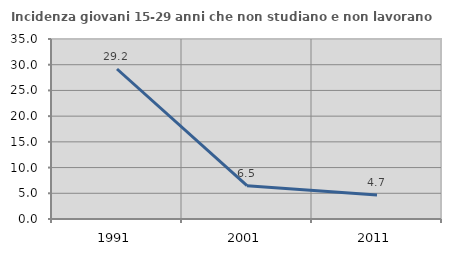
| Category | Incidenza giovani 15-29 anni che non studiano e non lavorano  |
|---|---|
| 1991.0 | 29.167 |
| 2001.0 | 6.472 |
| 2011.0 | 4.667 |